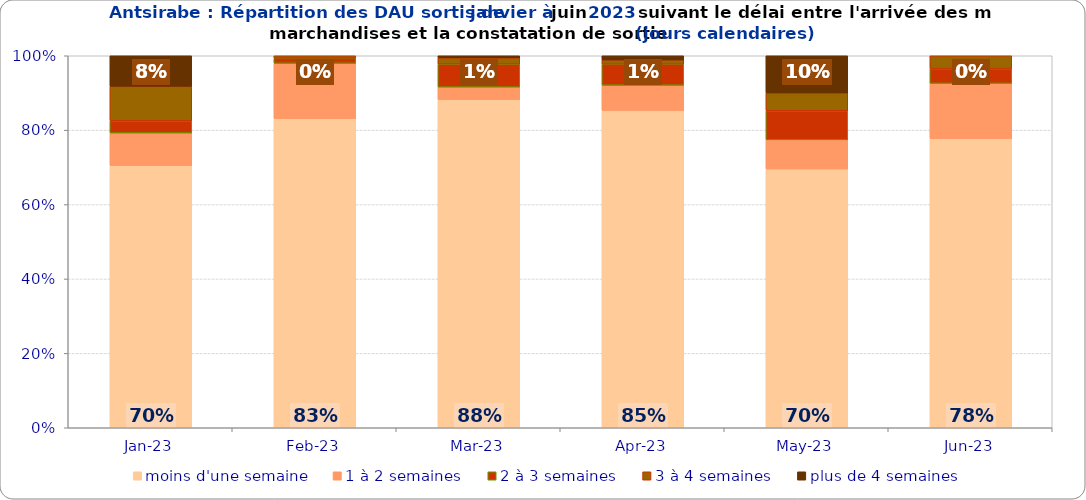
| Category | moins d'une semaine | 1 à 2 semaines | 2 à 3 semaines | 3 à 4 semaines | plus de 4 semaines |
|---|---|---|---|---|---|
| 2023-01-01 | 0.705 | 0.087 | 0.033 | 0.093 | 0.082 |
| 2023-02-01 | 0.831 | 0.149 | 0.014 | 0.007 | 0 |
| 2023-03-01 | 0.882 | 0.034 | 0.062 | 0.017 | 0.006 |
| 2023-04-01 | 0.853 | 0.068 | 0.056 | 0.011 | 0.011 |
| 2023-05-01 | 0.696 | 0.078 | 0.078 | 0.048 | 0.1 |
| 2023-06-01 | 0.777 | 0.149 | 0.04 | 0.035 | 0 |